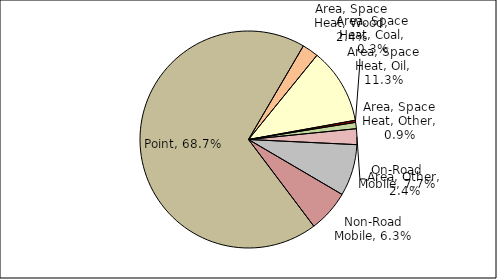
| Category | Series 0 |
|---|---|
| Point | 0.687 |
| Area, Space Heat, Wood | 0.024 |
| Area, Space Heat, Oil | 0.113 |
| Area, Space Heat, Coal | 0.003 |
| Area, Space Heat, Other | 0.009 |
| Area, Other | 0.024 |
| On-Road Mobile | 0.077 |
| Non-Road Mobile | 0.063 |